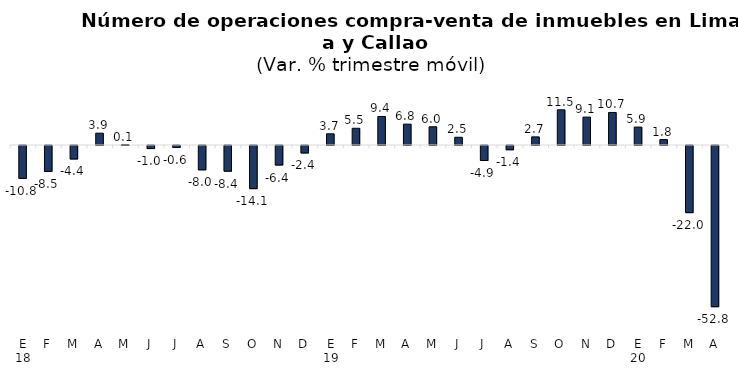
| Category | Series 0 |
|---|---|
| E 18 | -10.792 |
| F | -8.498 |
| M | -4.426 |
| A | 3.878 |
| M | 0.125 |
| J | -1.009 |
| J | -0.612 |
| A | -7.974 |
| S | -8.428 |
| O | -14.148 |
| N | -6.395 |
| D | -2.447 |
| E 19 | 3.671 |
| F | 5.491 |
| M | 9.352 |
| A | 6.835 |
| M | 5.983 |
| J | 2.532 |
| J | -4.916 |
| A | -1.39 |
| S | 2.666 |
| O | 11.537 |
| N | 9.145 |
| D | 10.675 |
| E 20 | 5.87 |
| F | 1.765 |
| M | -22.018 |
| A | -52.843 |